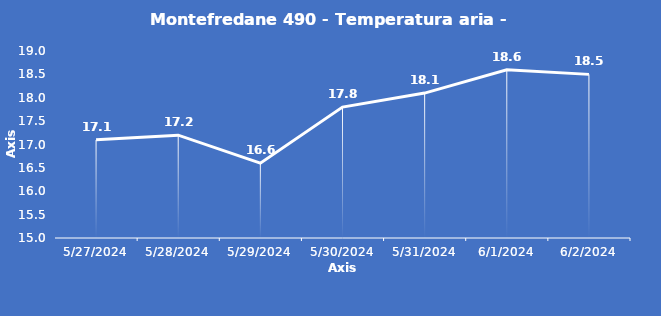
| Category | Montefredane 490 - Temperatura aria - Grezzo (°C) |
|---|---|
| 5/27/24 | 17.1 |
| 5/28/24 | 17.2 |
| 5/29/24 | 16.6 |
| 5/30/24 | 17.8 |
| 5/31/24 | 18.1 |
| 6/1/24 | 18.6 |
| 6/2/24 | 18.5 |